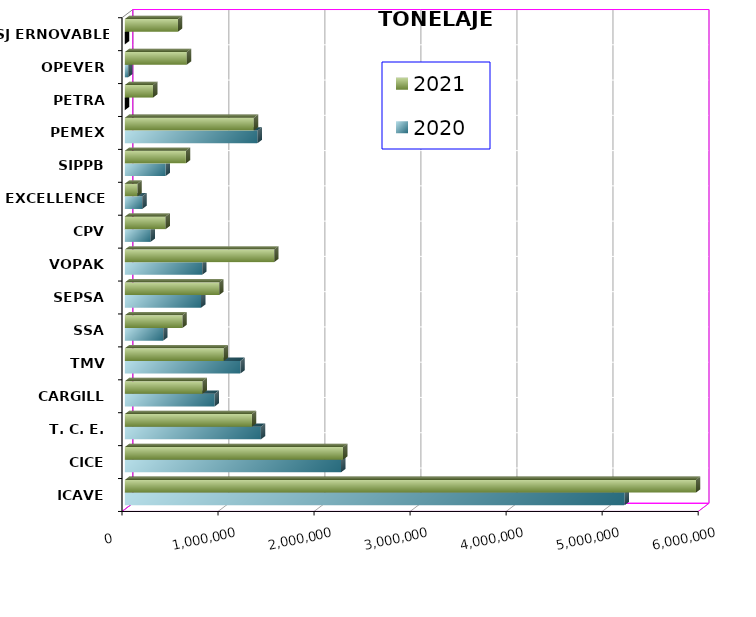
| Category | 2020 | 2021 |
|---|---|---|
| ICAVE | 5205381.25 | 5948208.505 |
| CICE | 2251945.08 | 2273093.477 |
| T. C. E. | 1416535.506 | 1323547.389 |
| CARGILL | 935864.256 | 809430.19 |
| TMV | 1203508.447 | 1030469.09 |
| SSA | 399818.161 | 600360.542 |
| SEPSA | 793685.91 | 983018.49 |
| VOPAK | 805586.205 | 1555621.37 |
| CPV | 268200.68 | 424159.563 |
| EXCELLENCE | 181927.519 | 131885.86 |
| SIPPB | 424829.388 | 635749.201 |
| PEMEX | 1382386.712 | 1343295.427 |
| PETRA | 0 | 294439.25 |
| OPEVER | 35307.737 | 645457.66 |
| ESJ ERNOVABLE III | 0 | 553319.679 |